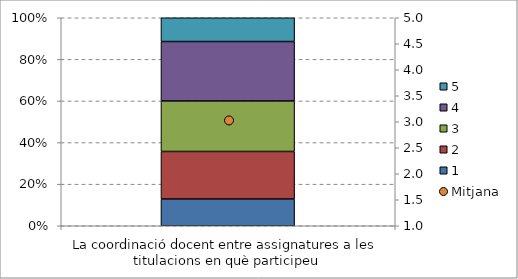
| Category | 1 | 2 | 3 | 4 | 5 |
|---|---|---|---|---|---|
| La coordinació docent entre assignatures a les titulacions en què participeu | 0.129 | 0.229 | 0.243 | 0.286 | 0.114 |